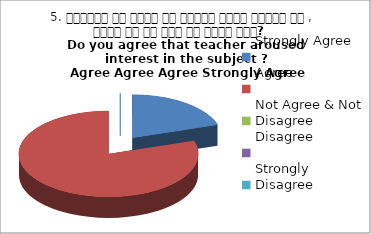
| Category | 5. शिक्षक ने विषय के प्रति रूचि जागृत की , क्या आप इस बात से सहमत हैं?  
Do you agree that teacher aroused interest in the subject ?
 Agree Agree Agree Strongly Agree Agree |
|---|---|
| Strongly Agree | 1 |
| Agree | 4 |
| Not Agree & Not Disagree | 0 |
| Disagree | 0 |
| Strongly Disagree | 0 |